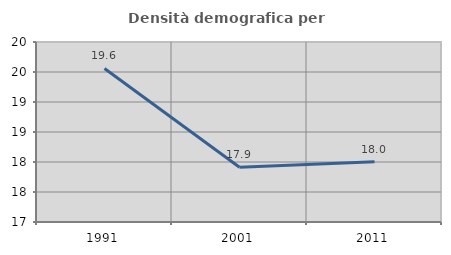
| Category | Densità demografica |
|---|---|
| 1991.0 | 19.559 |
| 2001.0 | 17.912 |
| 2011.0 | 18.004 |